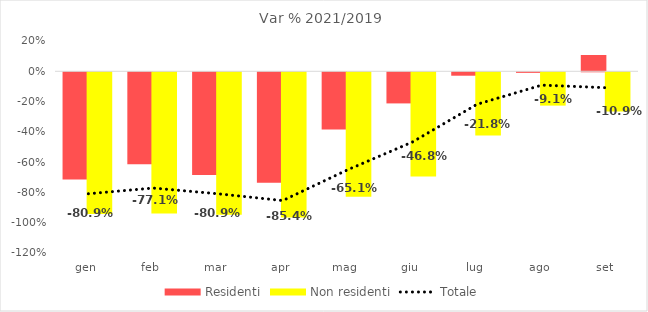
| Category | Residenti | Non residenti |
|---|---|---|
| gen | -0.708 | -0.935 |
| feb | -0.607 | -0.933 |
| mar | -0.678 | -0.941 |
| apr | -0.729 | -0.959 |
| mag | -0.377 | -0.822 |
| giu | -0.206 | -0.688 |
| lug | -0.023 | -0.418 |
| ago | -0.004 | -0.22 |
| set | 0.107 | -0.259 |